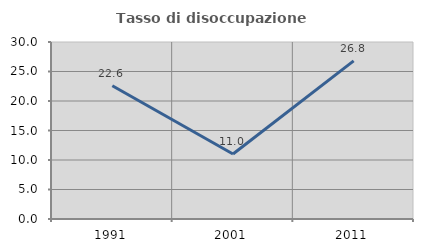
| Category | Tasso di disoccupazione giovanile  |
|---|---|
| 1991.0 | 22.581 |
| 2001.0 | 11.017 |
| 2011.0 | 26.804 |